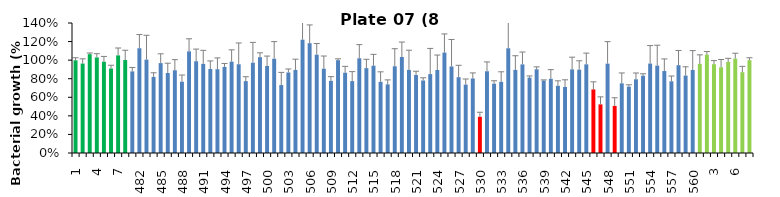
| Category | 8 h % |
|---|---|
| 1.0 | 0.998 |
| 2.0 | 0.963 |
| 3.0 | 1.064 |
| 4.0 | 1.029 |
| 5.0 | 0.983 |
| 6.0 | 0.91 |
| 7.0 | 1.051 |
| 8.0 | 1.001 |
| 481.0 | 0.879 |
| 482.0 | 1.128 |
| 483.0 | 1.006 |
| 484.0 | 0.819 |
| 485.0 | 0.968 |
| 486.0 | 0.862 |
| 487.0 | 0.891 |
| 488.0 | 0.768 |
| 489.0 | 1.094 |
| 490.0 | 0.988 |
| 491.0 | 0.96 |
| 492.0 | 0.904 |
| 493.0 | 0.902 |
| 494.0 | 0.927 |
| 495.0 | 0.983 |
| 496.0 | 0.956 |
| 497.0 | 0.774 |
| 498.0 | 0.972 |
| 499.0 | 1.032 |
| 500.0 | 0.937 |
| 501.0 | 1.015 |
| 502.0 | 0.732 |
| 503.0 | 0.867 |
| 504.0 | 0.895 |
| 505.0 | 1.22 |
| 506.0 | 1.183 |
| 507.0 | 1.059 |
| 508.0 | 0.908 |
| 509.0 | 0.777 |
| 510.0 | 1 |
| 511.0 | 0.865 |
| 512.0 | 0.774 |
| 513.0 | 1.02 |
| 514.0 | 0.914 |
| 515.0 | 0.94 |
| 516.0 | 0.766 |
| 517.0 | 0.739 |
| 518.0 | 0.934 |
| 519.0 | 1.034 |
| 520.0 | 0.895 |
| 521.0 | 0.84 |
| 522.0 | 0.781 |
| 523.0 | 0.85 |
| 524.0 | 0.894 |
| 525.0 | 1.081 |
| 526.0 | 0.932 |
| 527.0 | 0.817 |
| 528.0 | 0.737 |
| 529.0 | 0.803 |
| 530.0 | 0.39 |
| 531.0 | 0.88 |
| 532.0 | 0.747 |
| 533.0 | 0.766 |
| 534.0 | 1.128 |
| 535.0 | 0.895 |
| 536.0 | 0.954 |
| 537.0 | 0.812 |
| 538.0 | 0.902 |
| 539.0 | 0.78 |
| 540.0 | 0.799 |
| 541.0 | 0.724 |
| 542.0 | 0.711 |
| 543.0 | 0.901 |
| 544.0 | 0.897 |
| 545.0 | 0.955 |
| 546.0 | 0.685 |
| 547.0 | 0.524 |
| 548.0 | 0.962 |
| 549.0 | 0.507 |
| 550.0 | 0.75 |
| 551.0 | 0.715 |
| 552.0 | 0.794 |
| 553.0 | 0.832 |
| 554.0 | 0.963 |
| 555.0 | 0.941 |
| 556.0 | 0.883 |
| 557.0 | 0.772 |
| 558.0 | 0.946 |
| 559.0 | 0.834 |
| 560.0 | 0.894 |
| 1.0 | 0.96 |
| 2.0 | 1.059 |
| 3.0 | 0.956 |
| 4.0 | 0.923 |
| 5.0 | 0.981 |
| 6.0 | 1.017 |
| 7.0 | 0.87 |
| 8.0 | 0.999 |